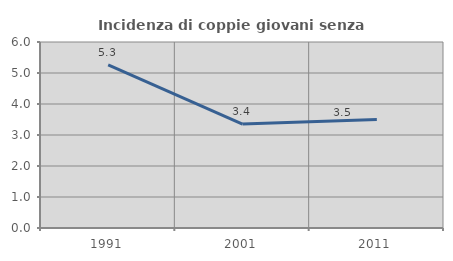
| Category | Incidenza di coppie giovani senza figli |
|---|---|
| 1991.0 | 5.263 |
| 2001.0 | 3.354 |
| 2011.0 | 3.502 |